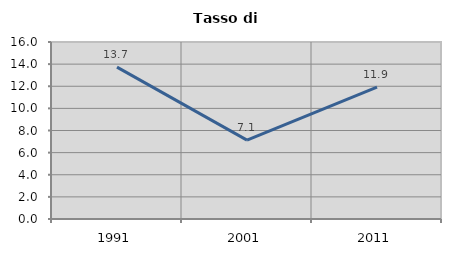
| Category | Tasso di disoccupazione   |
|---|---|
| 1991.0 | 13.728 |
| 2001.0 | 7.135 |
| 2011.0 | 11.929 |